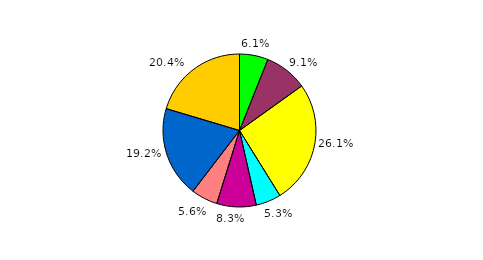
| Category | Series 0 |
|---|---|
| 0 | 6.04 |
| 1 | 9.072 |
| 2 | 26.036 |
| 3 | 5.323 |
| 4 | 8.331 |
| 5 | 5.601 |
| 6 | 19.209 |
| 7 | 20.389 |